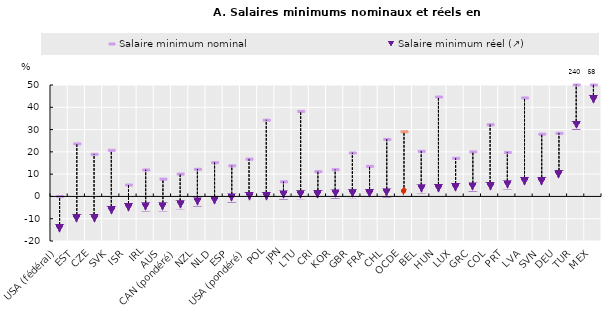
| Category | Salaire minimum nominal | Salaire minimum réel (↗) |
|---|---|---|
| USA (fédéral) | 0 | -14.354 |
| EST | 23.563 | -9.893 |
| CZE | 18.9 | -9.858 |
| SVK | 20.702 | -6.215 |
| ISR | 5.117 | -4.971 |
| IRL | 11.881 | -4.666 |
| AUS | 7.762 | -4.644 |
| CAN (pondéré) | 10.021 | -3.715 |
| NZL | 12.169 | -2.473 |
| NLD | 15.141 | -1.648 |
| ESP | 13.708 | -0.689 |
| USA (pondéré) | 16.725 | -0.029 |
| POL | 34.231 | 0.041 |
| JPN | 6.541 | 0.661 |
| LTU | 38.172 | 0.798 |
| CRI | 11.105 | 1.083 |
| KOR | 11.991 | 1.107 |
| GBR | 19.495 | 1.261 |
| FRA | 13.498 | 1.436 |
| CHL | 25.574 | 1.59 |
| OCDE | 29.005 | 2.304 |
| BEL | 20.254 | 3.43 |
| HUN | 44.6 | 3.691 |
| LUX | 17.098 | 4.03 |
| GRC | 19.972 | 4.241 |
| COL | 32.148 | 4.506 |
| PRT | 19.685 | 5.211 |
| LVA | 44.186 | 6.844 |
| SVN | 27.938 | 6.882 |
| DEU | 28.342 | 9.945 |
| TUR | 50 | 31.99 |
| MEX | 50 | 43.622 |